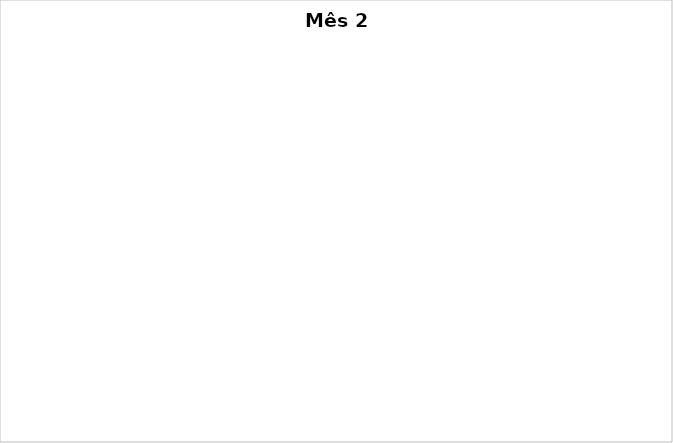
| Category | Series 0 |
|---|---|
| SUBTOTAL CASA | 0 |
| SUBTOTAL ESTUDOS | 0 |
| SUBTOTAL SAÚDE | 0 |
| SUBTOTAL PESSOAL | 0 |
| SUBTOTAL FILHOS | 0 |
| SUBTOTAL CARRO | 0 |
| SUBTOTAL TRABALHO | 0 |
| SUBTOTAL LAZER | 0 |
| SUBTOTAL PRESENTES | 0 |
| SUBTOTAL FINANCEIRO | 0 |
| SUBTOTAL EVENTUAIS | 0 |
| SUBTOTAL ANUAIS | 0 |
| SUBTOTAL OUTROS | 0 |